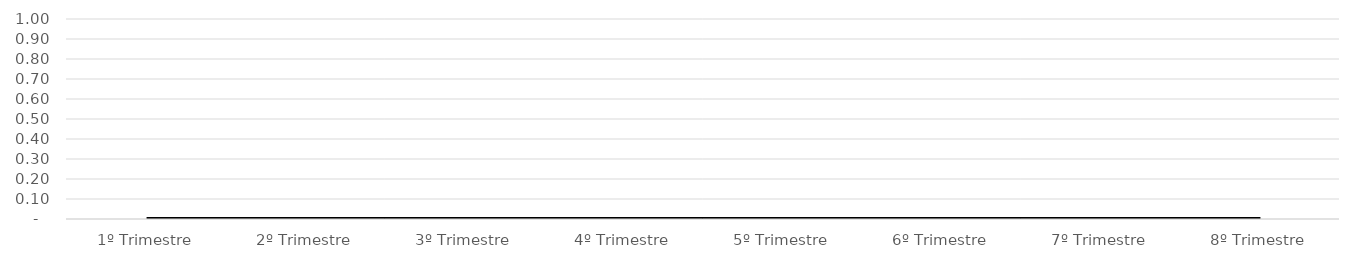
| Category | Total |
|---|---|
| 1º Trimestre | 0 |
| 2º Trimestre | 0 |
| 3º Trimestre | 0 |
| 4º Trimestre | 0 |
| 5º Trimestre | 0 |
| 6º Trimestre | 0 |
| 7º Trimestre | 0 |
| 8º Trimestre | 0 |